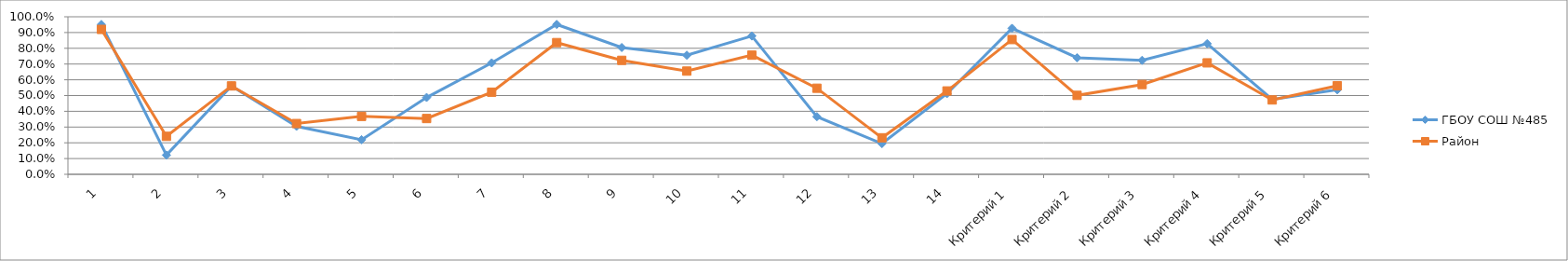
| Category | ГБОУ СОШ №485 | Район |
|---|---|---|
| 1 | 0.951 | 0.92 |
| 2 | 0.122 | 0.241 |
| 3 | 0.561 | 0.561 |
| 4 | 0.305 | 0.322 |
| 5 | 0.22 | 0.368 |
| 6 | 0.488 | 0.354 |
| 7 | 0.707 | 0.521 |
| 8 | 0.951 | 0.836 |
| 9 | 0.805 | 0.723 |
| 10 | 0.756 | 0.655 |
| 11 | 0.878 | 0.756 |
| 12 | 0.366 | 0.546 |
| 13 | 0.195 | 0.232 |
| 14 | 0.512 | 0.529 |
| Критерий 1 | 0.927 | 0.855 |
| Критерий 2 | 0.74 | 0.501 |
| Критерий 3 | 0.724 | 0.57 |
| Критерий 4 | 0.829 | 0.707 |
| Критерий 5 | 0.476 | 0.472 |
| Критерий 6 | 0.537 | 0.562 |